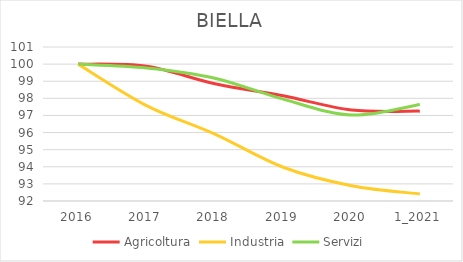
| Category | Agricoltura | Industria | Servizi |
|---|---|---|---|
| 2016 | 100 | 100 | 100 |
| 2017 | 99.872 | 97.578 | 99.778 |
| 2018 | 98.85 | 95.91 | 99.177 |
| 2019 | 98.147 | 93.972 | 97.951 |
| 2020 | 97.316 | 92.896 | 97.022 |
| 1_2021 | 97.252 | 92.411 | 97.639 |